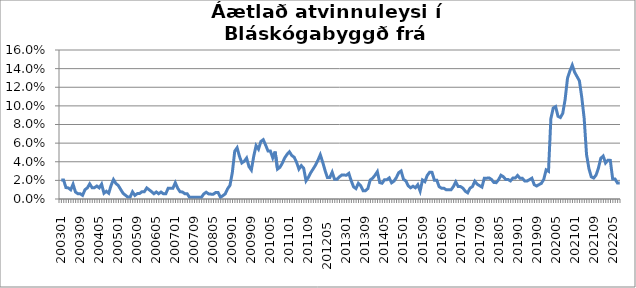
| Category | Series 0 |
|---|---|
| 200301 | 0.02 |
| 200302 | 0.02 |
| 200303 | 0.012 |
| 200304 | 0.012 |
| 200305 | 0.01 |
| 200306 | 0.016 |
| 200307 | 0.008 |
| 200308 | 0.006 |
| 200309 | 0.006 |
| 200310 | 0.004 |
| 200311 | 0.01 |
| 200312 | 0.012 |
| 200401 | 0.016 |
| 200402 | 0.012 |
| 200403 | 0.012 |
| 200404 | 0.014 |
| 200405 | 0.012 |
| 200406 | 0.016 |
| 200407 | 0.006 |
| 200408 | 0.008 |
| 200409 | 0.006 |
| 200410 | 0.015 |
| 200411 | 0.021 |
| 200412 | 0.017 |
| 200501 | 0.015 |
| 200502 | 0.01 |
| 200503 | 0.006 |
| 200504 | 0.004 |
| 200505 | 0.002 |
| 200506 | 0.002 |
| 200507 | 0.008 |
| 200508 | 0.004 |
| 200509 | 0.006 |
| 200510 | 0.006 |
| 200511 | 0.008 |
| 200512 | 0.008 |
| 200601 | 0.012 |
| 200602 | 0.01 |
| 200603 | 0.008 |
| 200604 | 0.006 |
| 200605 | 0.008 |
| 200606 | 0.006 |
| 200607 | 0.007 |
| 200608 | 0.006 |
| 200609 | 0.006 |
| 200610 | 0.012 |
| 200611 | 0.012 |
| 200612 | 0.012 |
| 200701 | 0.017 |
| 200702 | 0.012 |
| 200703 | 0.008 |
| 200704 | 0.008 |
| 200705 | 0.006 |
| 200706 | 0.006 |
| 200707 | 0.002 |
| 200708 | 0.002 |
| 200709 | 0.002 |
| 200710 | 0.002 |
| 200711 | 0.002 |
| 200712 | 0.002 |
| 200801 | 0.005 |
| 200802 | 0.007 |
| 200803 | 0.005 |
| 200804 | 0.005 |
| 200805 | 0.005 |
| 200806 | 0.007 |
| 200807 | 0.007 |
| 200808 | 0.002 |
| 200809 | 0.004 |
| 200810 | 0.005 |
| 200811 | 0.011 |
| 200812 | 0.015 |
| 200901 | 0.028 |
| 200902 | 0.051 |
| 200903 | 0.055 |
| 200904 | 0.046 |
| 200905 | 0.039 |
| 200906 | 0.04 |
| 200907 | 0.044 |
| 200908 | 0.035 |
| 200909 | 0.031 |
| 200910 | 0.046 |
| 200911 | 0.057 |
| 200912 | 0.054 |
| 201001 | 0.062 |
| 201002 | 0.064 |
| 201003 | 0.058 |
| 201004 | 0.052 |
| 201005 | 0.052 |
| 201006 | 0.044 |
| 201007 | 0.051 |
| 201008 | 0.032 |
| 201009 | 0.034 |
| 201010 | 0.038 |
| 201011 | 0.044 |
| 201012 | 0.048 |
| 201101 | 0.051 |
| 201102 | 0.047 |
| 201103 | 0.045 |
| 201104 | 0.04 |
| 201105 | 0.032 |
| 201106 | 0.036 |
| 201107 | 0.033 |
| 201108 | 0.019 |
| 201109 | 0.023 |
| 201110 | 0.028 |
| 201111 | 0.032 |
| 201112 | 0.036 |
| 201201  | 0.042 |
| 201202  | 0.048 |
| 201203  | 0.04 |
| 201204  | 0.031 |
| 201205  | 0.023 |
| 201206  | 0.023 |
| 201207  | 0.029 |
| 201208  | 0.021 |
| 201209  | 0.021 |
| 201210  | 0.024 |
| 201211  | 0.026 |
| 201212  | 0.026 |
| 201301 | 0.026 |
| 201302 | 0.028 |
| 201303 | 0.02 |
| 201304 | 0.013 |
| 201305 | 0.011 |
| 201306 | 0.017 |
| 201307 | 0.014 |
| 201308 | 0.009 |
| 201309 | 0.009 |
| 201310 | 0.011 |
| 201311 | 0.02 |
| 201312 | 0.022 |
| 201401 | 0.025 |
| 201402 | 0.029 |
| 201403 | 0.018 |
| 201404 | 0.017 |
| 201405 | 0.021 |
| 201406 | 0.021 |
| 201407 | 0.023 |
| 201408 | 0.017 |
| 201409 | 0.019 |
| 201410 | 0.023 |
| 201411 | 0.028 |
| 201412 | 0.03 |
| 201501 | 0.021 |
| 201502 | 0.019 |
| 201503 | 0.014 |
| 201504 | 0.012 |
| 201505 | 0.014 |
| 201506 | 0.012 |
| 201507 | 0.015 |
| 201508 | 0.009 |
| 201509 | 0.02 |
| 201510 | 0.019 |
| 201511 | 0.025 |
| 201512 | 0.029 |
| 201601 | 0.029 |
| 201602 | 0.02 |
| 201603 | 0.02 |
| 201604 | 0.013 |
| 201605 | 0.012 |
| 201606 | 0.012 |
| 201607 | 0.01 |
| 201608 | 0.01 |
| 201609 | 0.01 |
| 201610 | 0.013 |
| 201611 | 0.018 |
| 201612 | 0.013 |
| 201701 | 0.013 |
| 201702 | 0.012 |
| 201703 | 0.008 |
| 201704 | 0.007 |
| 201705 | 0.012 |
| 201706 | 0.013 |
| 201707 | 0.019 |
| 201708 | 0.016 |
| 201709 | 0.014 |
| 201710 | 0.013 |
| 201711 | 0.022 |
| 201712 | 0.022 |
| 201801 | 0.023 |
| 201802 | 0.021 |
| 201803 | 0.018 |
| 201804 | 0.018 |
| 201805 | 0.021 |
| 201806 | 0.026 |
| 201807 | 0.024 |
| 201808 | 0.021 |
| 201809 | 0.021 |
| 201810 | 0.019 |
| 201811 | 0.022 |
| 201812 | 0.022 |
| 201901 | 0.025 |
| 201902 | 0.022 |
| 201903 | 0.022 |
| 201904 | 0.019 |
| 201905 | 0.019 |
| 201906 | 0.021 |
| 201907 | 0.022 |
| 201908 | 0.015 |
| 201909 | 0.014 |
| 201910 | 0.015 |
| 201911 | 0.017 |
| 201912 | 0.021 |
| 202001 | 0.031 |
| 202002 | 0.03 |
| 202003 | 0.086 |
| 202004 | 0.098 |
| 202005 | 0.099 |
| 202006 | 0.089 |
| 202007 | 0.087 |
| 202008 | 0.092 |
| 202009 | 0.107 |
| 202010 | 0.13 |
| 202011 | 0.138 |
| 202012 | 0.144 |
| 202101 | 0.136 |
| 202102 | 0.131 |
| 202103 | 0.127 |
| 202104 | 0.109 |
| 202105 | 0.087 |
| 202106 | 0.048 |
| 202107 | 0.033 |
| 202108 | 0.024 |
| 202109 | 0.022 |
| 202110 | 0.026 |
| 202111 | 0.033 |
| 202112 | 0.044 |
| 202201 | 0.046 |
| 202202 | 0.039 |
| 202203 | 0.042 |
| 202204 | 0.041 |
| 202205 | 0.021 |
| 202206 | 0.021 |
| 202207 | 0.017 |
| 202208 | 0.017 |